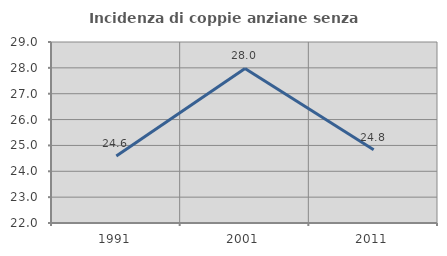
| Category | Incidenza di coppie anziane senza figli  |
|---|---|
| 1991.0 | 24.59 |
| 2001.0 | 27.976 |
| 2011.0 | 24.832 |